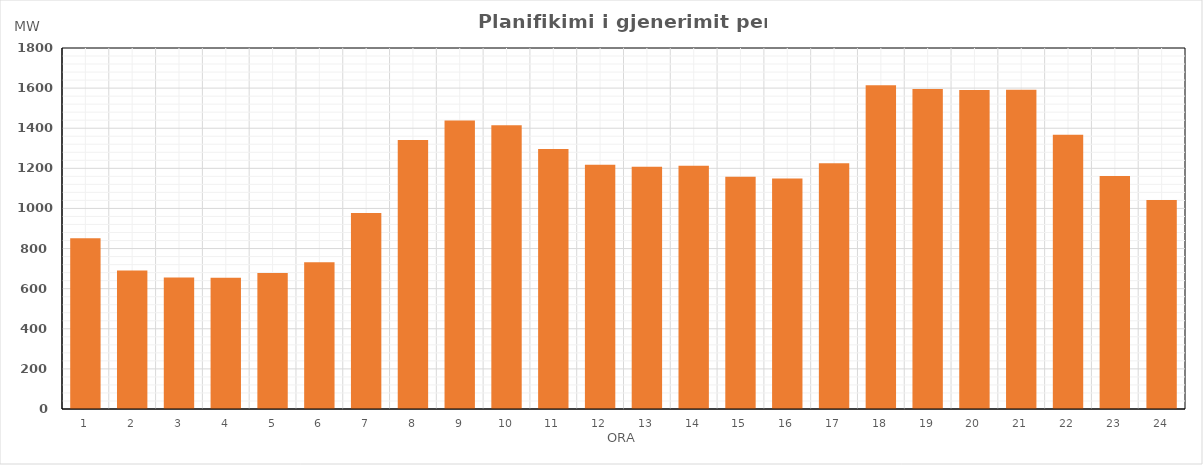
| Category | Max (MW) |
|---|---|
| 0 | 851.828 |
| 1 | 690.171 |
| 2 | 655.926 |
| 3 | 653.969 |
| 4 | 678.507 |
| 5 | 731.18 |
| 6 | 977.587 |
| 7 | 1341.042 |
| 8 | 1439.126 |
| 9 | 1414.92 |
| 10 | 1295.992 |
| 11 | 1217.733 |
| 12 | 1208.43 |
| 13 | 1212.823 |
| 14 | 1157.878 |
| 15 | 1149.801 |
| 16 | 1225.794 |
| 17 | 1614.861 |
| 18 | 1595.266 |
| 19 | 1591.122 |
| 20 | 1591.218 |
| 21 | 1367.762 |
| 22 | 1161.305 |
| 23 | 1042.381 |